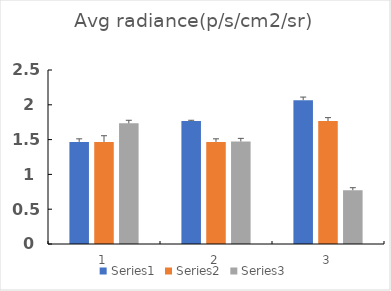
| Category | Series 0 | Series 1 | Series 2 |
|---|---|---|---|
| 0 | 1.467 | 1.467 | 1.733 |
| 1 | 1.767 | 1.467 | 1.473 |
| 2 | 2.067 | 1.767 | 0.773 |